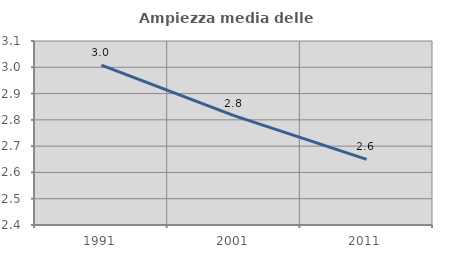
| Category | Ampiezza media delle famiglie |
|---|---|
| 1991.0 | 3.008 |
| 2001.0 | 2.816 |
| 2011.0 | 2.65 |